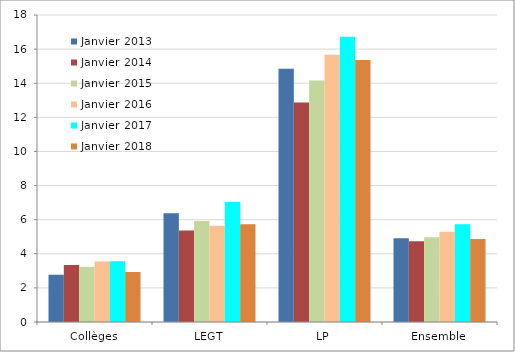
| Category | Janvier 2013 | Janvier 2014 | Janvier 2015 | Janvier 2016 | Janvier 2017 | Janvier 2018 |
|---|---|---|---|---|---|---|
| Collèges | 2.772 | 3.341 | 3.237 | 3.55 | 3.556 | 2.931 |
| LEGT | 6.376 | 5.36 | 5.915 | 5.648 | 7.029 | 5.737 |
| LP | 14.844 | 12.869 | 14.156 | 15.671 | 16.721 | 15.362 |
| Ensemble | 4.904 | 4.73 | 4.976 | 5.285 | 5.731 | 4.873 |